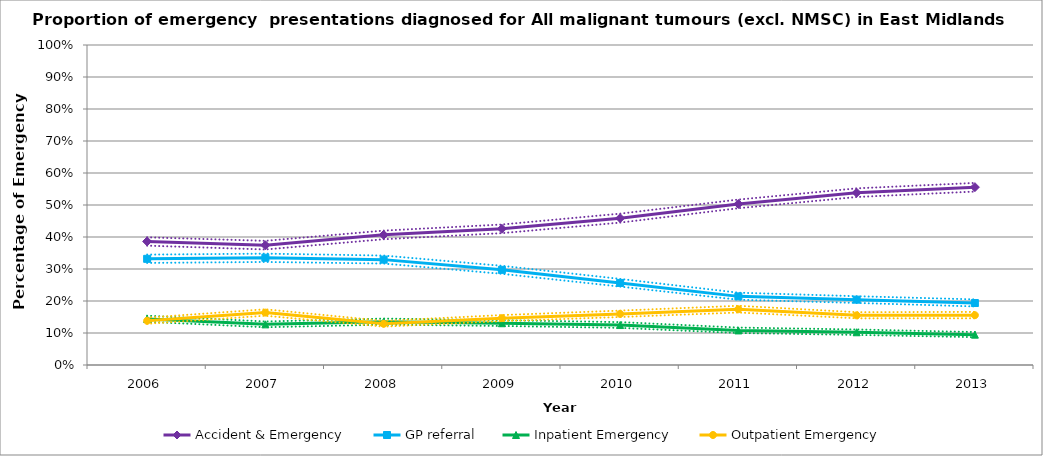
| Category | Accident & Emergency | Series 1 | Series 2 | GP referral | Series 4 | Series 5 | Inpatient Emergency | Series 7 | Series 8 | Outpatient Emergency | Series 10 | Series 11 |
|---|---|---|---|---|---|---|---|---|---|---|---|---|
| 2006.0 | 0.386 | 0.373 | 0.399 | 0.332 | 0.319 | 0.345 | 0.144 | 0.135 | 0.154 | 0.138 | 0.129 | 0.148 |
| 2007.0 | 0.374 | 0.361 | 0.388 | 0.335 | 0.322 | 0.348 | 0.127 | 0.118 | 0.136 | 0.164 | 0.154 | 0.174 |
| 2008.0 | 0.407 | 0.393 | 0.42 | 0.329 | 0.317 | 0.342 | 0.135 | 0.126 | 0.145 | 0.129 | 0.12 | 0.138 |
| 2009.0 | 0.426 | 0.412 | 0.439 | 0.297 | 0.285 | 0.31 | 0.131 | 0.122 | 0.14 | 0.146 | 0.137 | 0.156 |
| 2010.0 | 0.459 | 0.445 | 0.473 | 0.256 | 0.245 | 0.269 | 0.125 | 0.116 | 0.134 | 0.16 | 0.15 | 0.17 |
| 2011.0 | 0.503 | 0.49 | 0.517 | 0.214 | 0.204 | 0.226 | 0.108 | 0.1 | 0.117 | 0.174 | 0.164 | 0.185 |
| 2012.0 | 0.538 | 0.525 | 0.552 | 0.204 | 0.194 | 0.215 | 0.102 | 0.094 | 0.111 | 0.155 | 0.146 | 0.165 |
| 2013.0 | 0.556 | 0.542 | 0.569 | 0.194 | 0.183 | 0.205 | 0.095 | 0.087 | 0.103 | 0.156 | 0.146 | 0.166 |